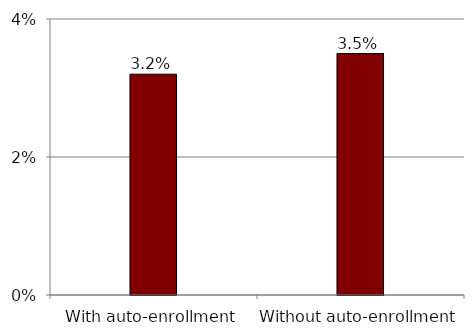
| Category | Series 0 |
|---|---|
| With auto-enrollment | 0.032 |
| Without auto-enrollment | 0.035 |